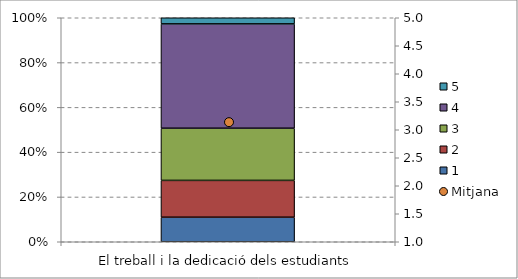
| Category | 1 | 2 | 3 | 4 | 5 |
|---|---|---|---|---|---|
| El treball i la dedicació dels estudiants | 8 | 12 | 17 | 34 | 2 |